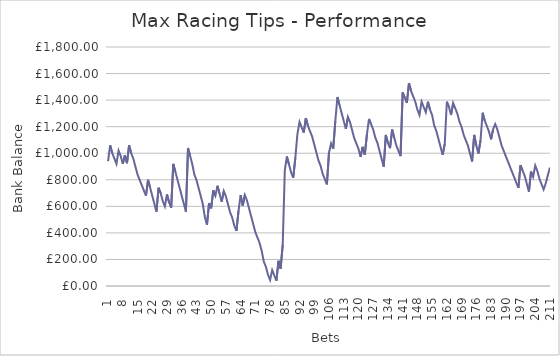
| Category | Balance @ price taken |
|---|---|
| 0 | 940 |
| 1 | 1060 |
| 2 | 1000 |
| 3 | 960 |
| 4 | 920 |
| 5 | 1020 |
| 6 | 980 |
| 7 | 920 |
| 8 | 984.8 |
| 9 | 924.8 |
| 10 | 1059.8 |
| 11 | 999.8 |
| 12 | 959.8 |
| 13 | 899.8 |
| 14 | 839.8 |
| 15 | 799.8 |
| 16 | 759.8 |
| 17 | 719.8 |
| 18 | 679.8 |
| 19 | 799.8 |
| 20 | 739.8 |
| 21 | 679.8 |
| 22 | 619.8 |
| 23 | 559.8 |
| 24 | 739.8 |
| 25 | 699.8 |
| 26 | 639.8 |
| 27 | 599.8 |
| 28 | 689.8 |
| 29 | 629.8 |
| 30 | 589.8 |
| 31 | 919.8 |
| 32 | 859.8 |
| 33 | 799.8 |
| 34 | 739.8 |
| 35 | 679.8 |
| 36 | 619.8 |
| 37 | 559.8 |
| 38 | 1039.8 |
| 39 | 979.8 |
| 40 | 919.8 |
| 41 | 839.8 |
| 42 | 799.8 |
| 43 | 739.8 |
| 44 | 679.8 |
| 45 | 619.8 |
| 46 | 519.8 |
| 47 | 459.8 |
| 48 | 624.8 |
| 49 | 584.8 |
| 50 | 719.8 |
| 51 | 679.8 |
| 52 | 755 |
| 53 | 695 |
| 54 | 635 |
| 55 | 715 |
| 56 | 675 |
| 57 | 615 |
| 58 | 555 |
| 59 | 515 |
| 60 | 455 |
| 61 | 415 |
| 62 | 565 |
| 63 | 685 |
| 64 | 605 |
| 65 | 685 |
| 66 | 645 |
| 67 | 585 |
| 68 | 525 |
| 69 | 465 |
| 70 | 405 |
| 71 | 365 |
| 72 | 325 |
| 73 | 265 |
| 74 | 185 |
| 75 | 145 |
| 76 | 85 |
| 77 | 45 |
| 78 | 120.2 |
| 79 | 80.2 |
| 80 | 40.2 |
| 81 | 190.2 |
| 82 | 130.2 |
| 83 | 310.2 |
| 84 | 870.2 |
| 85 | 975.2 |
| 86 | 915.2 |
| 87 | 855.2 |
| 88 | 815.2 |
| 89 | 965.2 |
| 90 | 1145.2 |
| 91 | 1235.2 |
| 92 | 1195.2 |
| 93 | 1155.2 |
| 94 | 1265.2 |
| 95 | 1205.2 |
| 96 | 1165.2 |
| 97 | 1125.2 |
| 98 | 1065.2 |
| 99 | 1005.2 |
| 100 | 945.2 |
| 101 | 905.2 |
| 102 | 845.2 |
| 103 | 805.2 |
| 104 | 765.2 |
| 105 | 1005.2 |
| 106 | 1073 |
| 107 | 1033 |
| 108 | 1243 |
| 109 | 1423 |
| 110 | 1363 |
| 111 | 1303 |
| 112 | 1243 |
| 113 | 1183 |
| 114 | 1273 |
| 115 | 1233 |
| 116 | 1173 |
| 117 | 1113 |
| 118 | 1073 |
| 119 | 1033 |
| 120 | 973 |
| 121 | 1048 |
| 122 | 988 |
| 123 | 1138 |
| 124 | 1258 |
| 125 | 1218 |
| 126 | 1178 |
| 127 | 1118 |
| 128 | 1078 |
| 129 | 1018 |
| 130 | 958 |
| 131 | 898 |
| 132 | 1138 |
| 133 | 1078 |
| 134 | 1038 |
| 135 | 1178 |
| 136 | 1118 |
| 137 | 1058 |
| 138 | 1018 |
| 139 | 978 |
| 140 | 1458 |
| 141 | 1418 |
| 142 | 1378 |
| 143 | 1528 |
| 144 | 1468 |
| 145 | 1428 |
| 146 | 1388 |
| 147 | 1328 |
| 148 | 1288 |
| 149 | 1388 |
| 150 | 1348 |
| 151 | 1308 |
| 152 | 1388 |
| 153 | 1328 |
| 154 | 1288 |
| 155 | 1208 |
| 156 | 1168 |
| 157 | 1108 |
| 158 | 1048 |
| 159 | 988 |
| 160 | 1068 |
| 161 | 1388 |
| 162 | 1348 |
| 163 | 1288 |
| 164 | 1378 |
| 165 | 1338 |
| 166 | 1298 |
| 167 | 1238 |
| 168 | 1198 |
| 169 | 1138 |
| 170 | 1098 |
| 171 | 1058 |
| 172 | 998 |
| 173 | 938 |
| 174 | 1138 |
| 175 | 1058 |
| 176 | 998 |
| 177 | 1095.8 |
| 178 | 1304.8 |
| 179 | 1244.8 |
| 180 | 1204.8 |
| 181 | 1164.8 |
| 182 | 1104.8 |
| 183 | 1180.8 |
| 184 | 1218.8 |
| 185 | 1178.8 |
| 186 | 1118.8 |
| 187 | 1058.8 |
| 188 | 1018.8 |
| 189 | 978.8 |
| 190 | 938.8 |
| 191 | 898.8 |
| 192 | 858.8 |
| 193 | 818.8 |
| 194 | 778.8 |
| 195 | 738.8 |
| 196 | 909.8 |
| 197 | 869.8 |
| 198 | 829.8 |
| 199 | 769.8 |
| 200 | 709.8 |
| 201 | 861.8 |
| 202 | 821.8 |
| 203 | 907.3 |
| 204 | 867.3 |
| 205 | 807.3 |
| 206 | 767.3 |
| 207 | 727.3 |
| 208 | 772.9 |
| 209 | 834.84 |
| 210 | 891.84 |